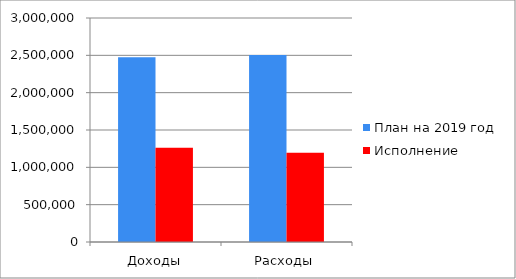
| Category | План на 2019 год | Исполнение |
|---|---|---|
| Доходы | 2475342 | 1263864 |
| Расходы | 2504105 | 1196735 |